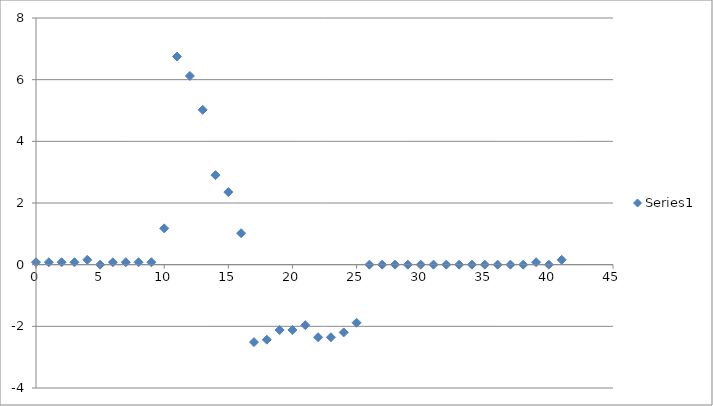
| Category | Series 0 |
|---|---|
| 0.0 | 0.078 |
| 1.0 | 0.078 |
| 2.0 | 0.078 |
| 3.0 | 0.078 |
| 4.0 | 0.157 |
| 5.0 | 0 |
| 6.0 | 0.078 |
| 7.0 | 0.078 |
| 8.0 | 0.078 |
| 9.0 | 0.078 |
| 10.0 | 1.177 |
| 11.0 | 6.749 |
| 12.0 | 6.121 |
| 13.0 | 5.023 |
| 14.0 | 2.904 |
| 15.0 | 2.354 |
| 16.0 | 1.02 |
| 17.0 | -2.511 |
| 18.0 | -2.433 |
| 19.0 | -2.119 |
| 20.0 | -2.119 |
| 21.0 | -1.962 |
| 22.0 | -2.354 |
| 23.0 | -2.354 |
| 24.0 | -2.197 |
| 25.0 | -1.884 |
| 26.0 | 0 |
| 27.0 | 0 |
| 28.0 | 0 |
| 29.0 | 0 |
| 30.0 | 0 |
| 31.0 | 0 |
| 32.0 | 0 |
| 33.0 | 0 |
| 34.0 | 0 |
| 35.0 | 0 |
| 36.0 | 0 |
| 37.0 | 0 |
| 38.0 | 0 |
| 39.0 | 0.078 |
| 40.0 | 0 |
| 41.0 | 0.157 |